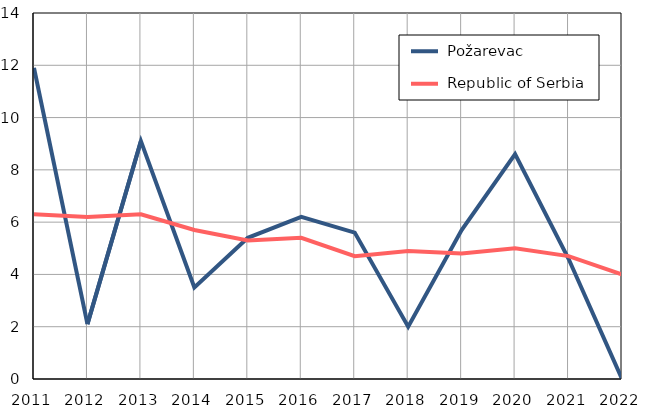
| Category |  Požarevac |  Republic of Serbia |
|---|---|---|
| 2011.0 | 11.9 | 6.3 |
| 2012.0 | 2.1 | 6.2 |
| 2013.0 | 9.1 | 6.3 |
| 2014.0 | 3.5 | 5.7 |
| 2015.0 | 5.4 | 5.3 |
| 2016.0 | 6.2 | 5.4 |
| 2017.0 | 5.6 | 4.7 |
| 2018.0 | 2 | 4.9 |
| 2019.0 | 5.7 | 4.8 |
| 2020.0 | 8.6 | 5 |
| 2021.0 | 4.6 | 4.7 |
| 2022.0 | 0 | 4 |